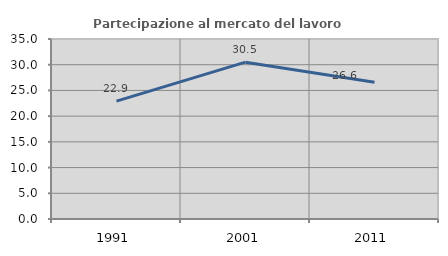
| Category | Partecipazione al mercato del lavoro  femminile |
|---|---|
| 1991.0 | 22.925 |
| 2001.0 | 30.493 |
| 2011.0 | 26.59 |